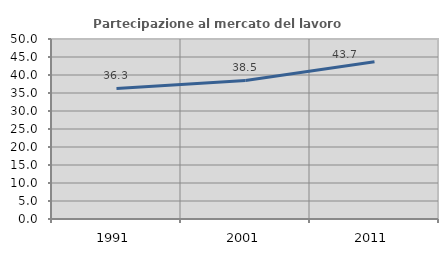
| Category | Partecipazione al mercato del lavoro  femminile |
|---|---|
| 1991.0 | 36.281 |
| 2001.0 | 38.497 |
| 2011.0 | 43.652 |